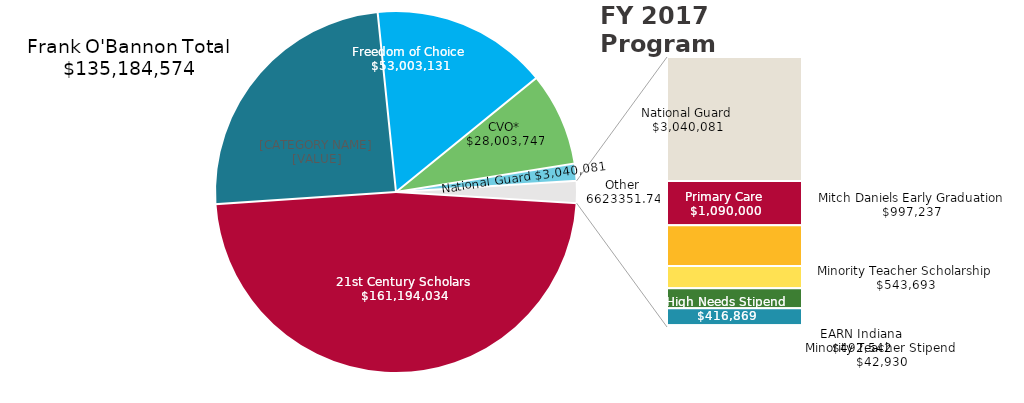
| Category | Series 0 |
|---|---|
| 21st Century Scholars | 161194034 |
| Higher Education Award | 82181443 |
| Freedom of Choice | 53003131 |
| CVO* | 28003747.42 |
| Adult Student Grant | 5183412 |
| National Guard | 3040080.8 |
| Primary Care | 1090000 |
| Mitch Daniels Early Graduation | 997236.5 |
| Minority Teacher Scholarship | 543693 |
| EARN Indiana | 492542.33 |
| High Needs Stipend | 416869.44 |
| Minority Teacher Stipend | 42929.67 |